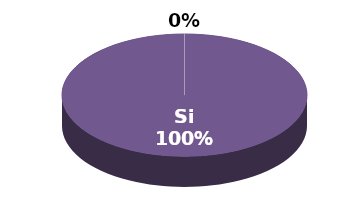
| Category | Series 1 |
|---|---|
| Si | 15 |